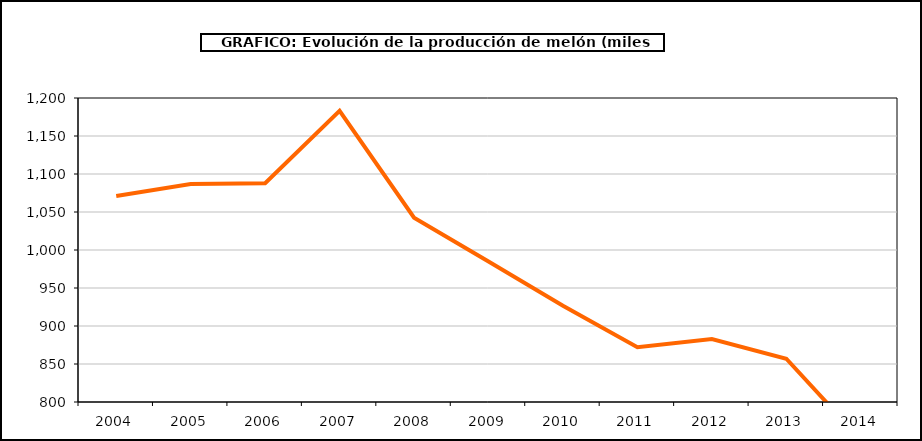
| Category | producción |
|---|---|
| 2004.0 | 1071.154 |
| 2005.0 | 1086.718 |
| 2006.0 | 1087.917 |
| 2007.0 | 1183.154 |
| 2008.0 | 1042.439 |
| 2009.0 | 984.786 |
| 2010.0 | 926.693 |
| 2011.0 | 871.996 |
| 2012.0 | 882.869 |
| 2013.0 | 856.951 |
| 2014.0 | 750.592 |